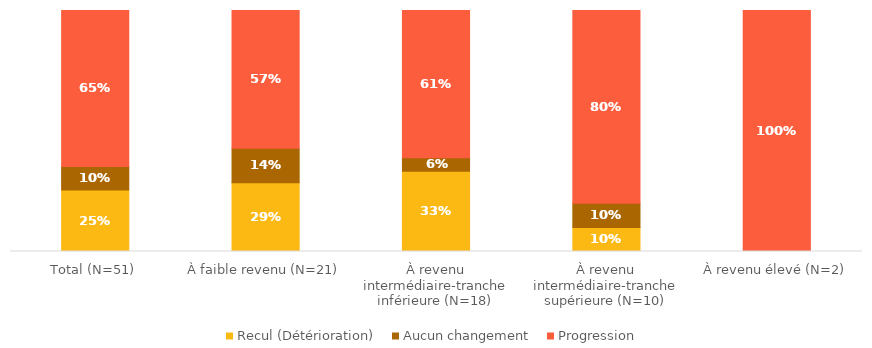
| Category | Recul (Détérioration) | Aucun changement | Progression  |
|---|---|---|---|
| Total (N=51) | 0.255 | 0.098 | 0.647 |
| À faible revenu (N=21) | 0.286 | 0.143 | 0.571 |
| À revenu intermédiaire-tranche inférieure (N=18) | 0.333 | 0.056 | 0.611 |
| À revenu intermédiaire-tranche supérieure (N=10) | 0.1 | 0.1 | 0.8 |
| À revenu élevé (N=2) | 0 | 0 | 1 |